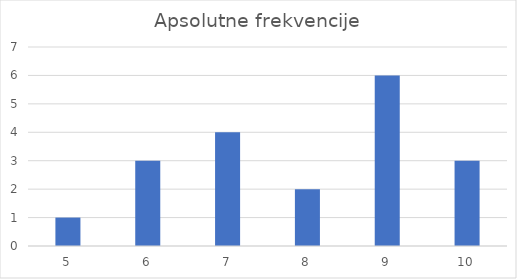
| Category | Apsolutne frekvencije |
|---|---|
| 5.0 | 1 |
| 6.0 | 3 |
| 7.0 | 4 |
| 8.0 | 2 |
| 9.0 | 6 |
| 10.0 | 3 |